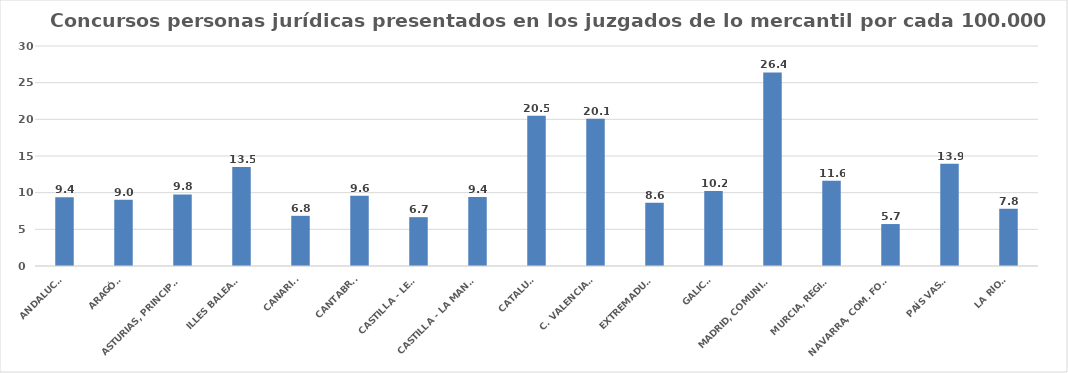
| Category | Series 0 |
|---|---|
| ANDALUCÍA | 9.367 |
| ARAGÓN | 9.048 |
| ASTURIAS, PRINCIPADO | 9.754 |
| ILLES BALEARS | 13.513 |
| CANARIAS | 6.842 |
| CANTABRIA | 9.566 |
| CASTILLA - LEÓN | 6.659 |
| CASTILLA - LA MANCHA | 9.399 |
| CATALUÑA | 20.494 |
| C. VALENCIANA | 20.086 |
| EXTREMADURA | 8.627 |
| GALICIA | 10.221 |
| MADRID, COMUNIDAD | 26.399 |
| MURCIA, REGIÓN | 11.62 |
| NAVARRA, COM. FORAL | 5.722 |
| PAÍS VASCO | 13.948 |
| LA RIOJA | 7.815 |